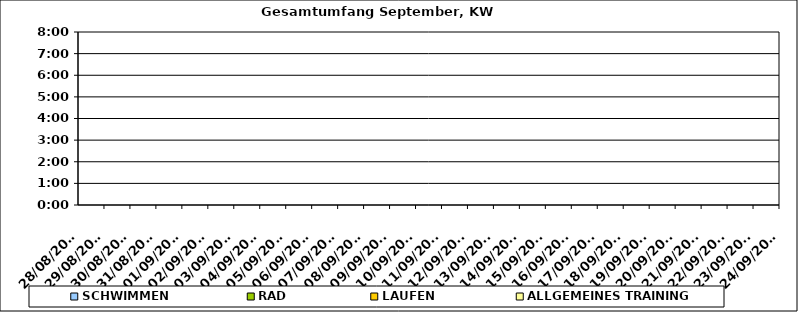
| Category | SCHWIMMEN | RAD | LAUFEN | ALLGEMEINES TRAINING |
|---|---|---|---|---|
| 28/08/2023 |  |  |  | 0 |
| 29/08/2023 |  |  |  | 0 |
| 30/08/2023 |  |  |  | 0 |
| 31/08/2023 |  |  |  | 0 |
| 01/09/2023 |  |  |  | 0 |
| 02/09/2023 |  |  |  | 0 |
| 03/09/2023 |  |  |  | 0 |
| 04/09/2023 |  |  |  | 0 |
| 05/09/2023 |  |  |  | 0 |
| 06/09/2023 |  |  |  | 0 |
| 07/09/2023 |  |  |  | 0 |
| 08/09/2023 |  |  |  | 0 |
| 09/09/2023 |  |  |  | 0 |
| 10/09/2023 |  |  |  | 0 |
| 11/09/2023 |  |  |  | 0 |
| 12/09/2023 |  |  |  | 0 |
| 13/09/2023 |  |  |  | 0 |
| 14/09/2023 |  |  |  | 0 |
| 15/09/2023 |  |  |  | 0 |
| 16/09/2023 |  |  |  | 0 |
| 17/09/2023 |  |  |  | 0 |
| 18/09/2023 |  |  |  | 0 |
| 19/09/2023 |  |  |  | 0 |
| 20/09/2023 |  |  |  | 0 |
| 21/09/2023 |  |  |  | 0 |
| 22/09/2023 |  |  |  | 0 |
| 23/09/2023 |  |  |  | 0 |
| 24/09/2023 |  |  |  | 0 |